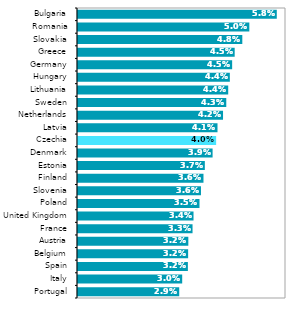
| Category | Series 1 |
|---|---|
| Portugal | 0.029 |
| Italy | 0.03 |
| Spain | 0.032 |
| Belgium | 0.032 |
| Austria | 0.032 |
| France | 0.033 |
| United Kingdom | 0.034 |
| Poland | 0.035 |
| Slovenia | 0.036 |
| Finland | 0.036 |
| Estonia | 0.037 |
| Denmark | 0.039 |
| Czechia | 0.04 |
| Latvia | 0.041 |
| Netherlands | 0.042 |
| Sweden | 0.043 |
| Lithuania | 0.044 |
| Hungary | 0.044 |
| Germany | 0.045 |
| Greece | 0.045 |
| Slovakia | 0.048 |
| Romania | 0.05 |
| Bulgaria | 0.058 |